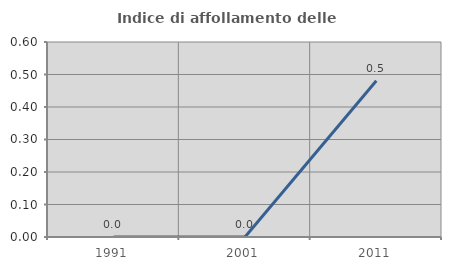
| Category | Indice di affollamento delle abitazioni  |
|---|---|
| 1991.0 | 0 |
| 2001.0 | 0 |
| 2011.0 | 0.481 |